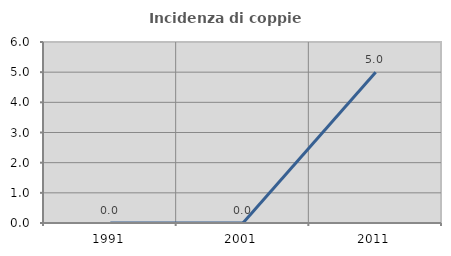
| Category | Incidenza di coppie miste |
|---|---|
| 1991.0 | 0 |
| 2001.0 | 0 |
| 2011.0 | 5 |